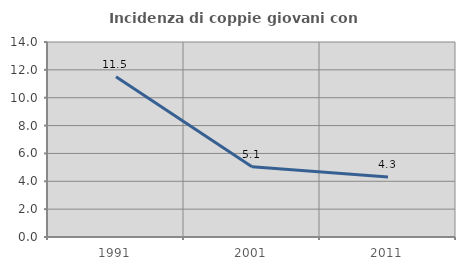
| Category | Incidenza di coppie giovani con figli |
|---|---|
| 1991.0 | 11.504 |
| 2001.0 | 5.051 |
| 2011.0 | 4.301 |